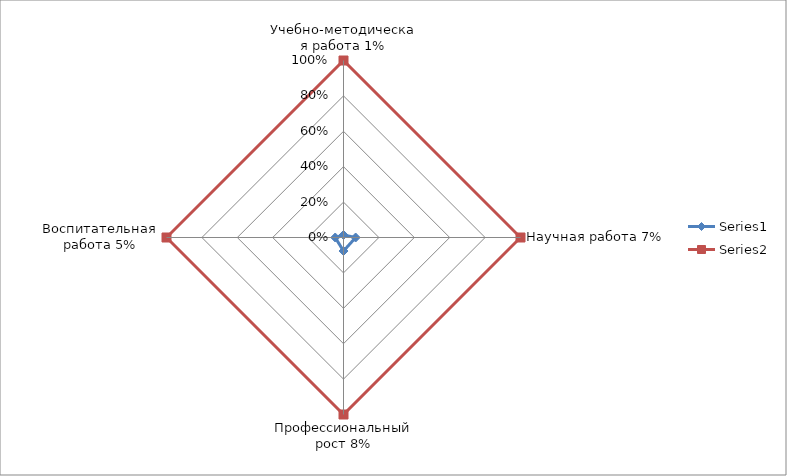
| Category | Series 0 | Series 1 |
|---|---|---|
| Учебно-методическая работа 1% | 0.014 | 1 |
| Научная работа 7% | 0.069 | 1 |
| Профессиональный рост 8% | 0.076 | 1 |
| Воспитательная работа 5% | 0.047 | 1 |